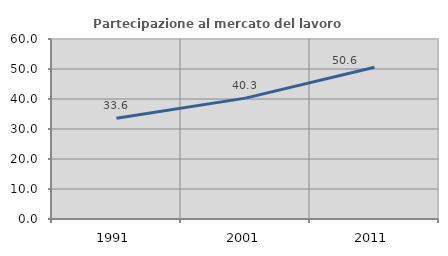
| Category | Partecipazione al mercato del lavoro  femminile |
|---|---|
| 1991.0 | 33.604 |
| 2001.0 | 40.288 |
| 2011.0 | 50.607 |